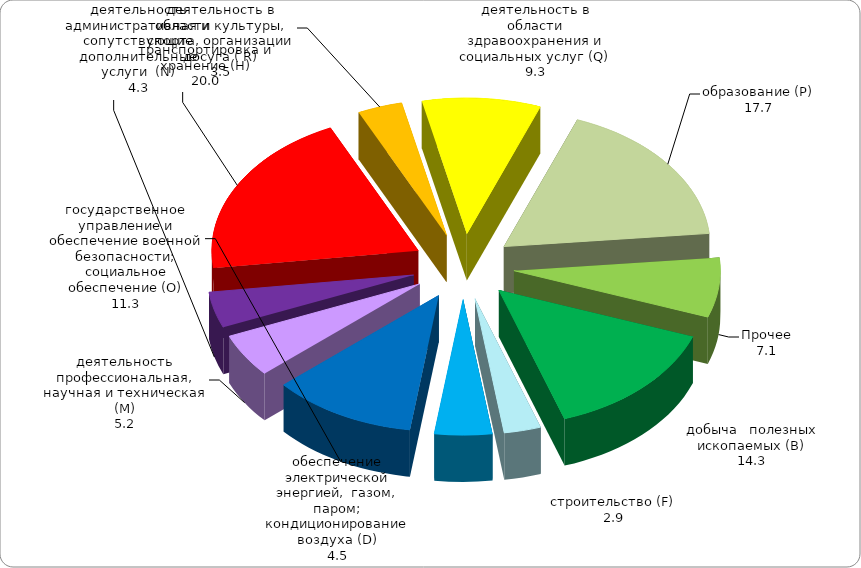
| Category | Series 3 | Series 2 | Series 1 | Series 0 |
|---|---|---|---|---|
|     добыча   полезных    ископаемых (В) | 14.286 |  |  |  |
| строительство (F) | 2.89 |  |  |  |
| обеспечение электрической энергией,  газом, паром; кондиционирование воздуха (D) | 4.503 |  |  |  |
| государственное управление и обеспечение военной безопасности; социальное обеспечение (О) | 11.299 |  |  |  |
| деятельность профессиональная, научная и техническая (М) | 5.168 |  |  |  |
| деятельность административная и сопутствующие дополнительные услуги  (N) | 4.272 |  |  |  |
| транспортировка и хранение (H) | 20.028 |  |  |  |
| деятельность в области культуры, спорта, организации досуга ( R) | 3.502 |  |  |  |
| деятельность в области здравоохранения и социальных услуг (Q) | 9.282 |  |  |  |
| образование (Р) | 17.669 |  |  |  |
| Прочее | 7.102 |  |  |  |